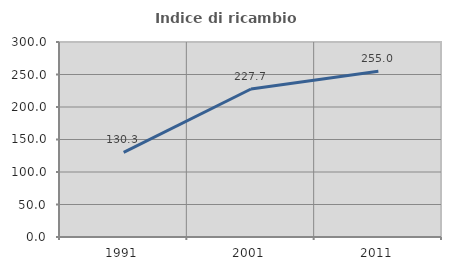
| Category | Indice di ricambio occupazionale  |
|---|---|
| 1991.0 | 130.27 |
| 2001.0 | 227.723 |
| 2011.0 | 254.955 |